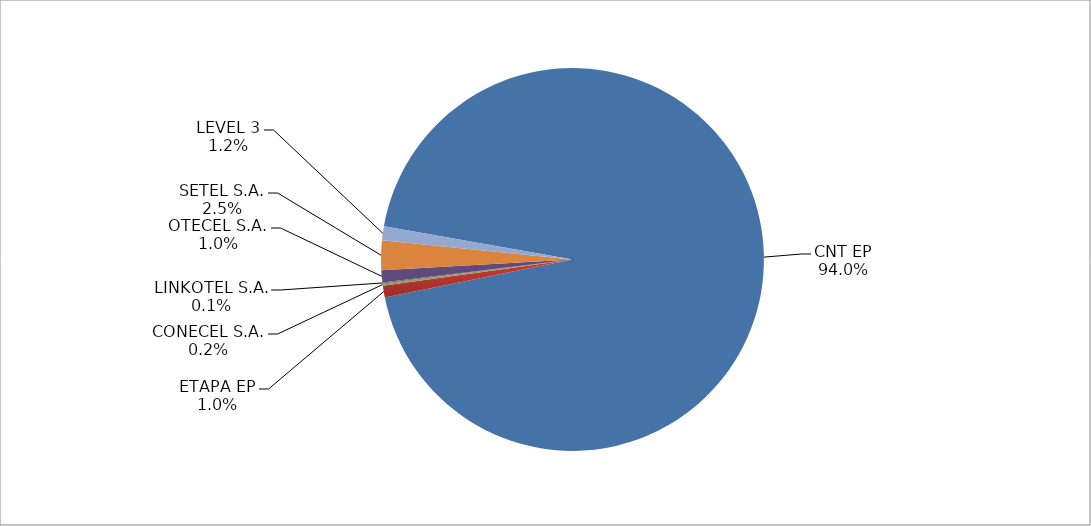
| Category | Series 0 |
|---|---|
| CNT EP | 2465 |
| ETAPA EP | 26 |
| CONECEL S.A. | 5 |
| LINKOTEL S.A. | 2 |
| OTECEL S.A. | 27 |
| SETEL S.A. | 65 |
| LEVEL 3 | 31 |